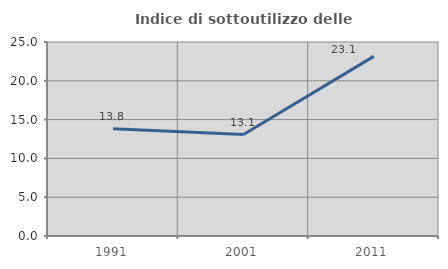
| Category | Indice di sottoutilizzo delle abitazioni  |
|---|---|
| 1991.0 | 13.831 |
| 2001.0 | 13.074 |
| 2011.0 | 23.147 |